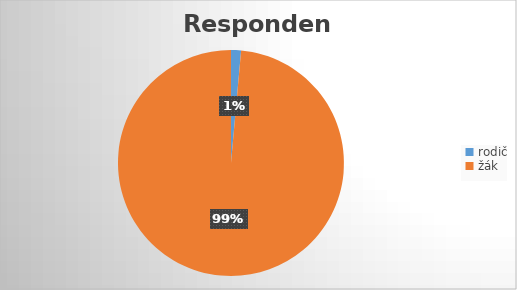
| Category | Series 0 |
|---|---|
| rodič | 1 |
| žák | 69 |